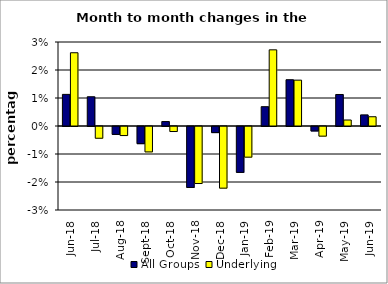
| Category | All Groups | Underlying |
|---|---|---|
| 2018-06-01 | 0.011 | 0.026 |
| 2018-07-01 | 0.01 | -0.004 |
| 2018-08-01 | -0.003 | -0.003 |
| 2018-09-01 | -0.006 | -0.009 |
| 2018-10-01 | 0.002 | -0.002 |
| 2018-11-01 | -0.022 | -0.02 |
| 2018-12-01 | -0.002 | -0.022 |
| 2019-01-01 | -0.016 | -0.011 |
| 2019-02-01 | 0.007 | 0.027 |
| 2019-03-01 | 0.017 | 0.016 |
| 2019-04-01 | -0.002 | -0.003 |
| 2019-05-01 | 0.011 | 0.002 |
| 2019-06-01 | 0.004 | 0.003 |